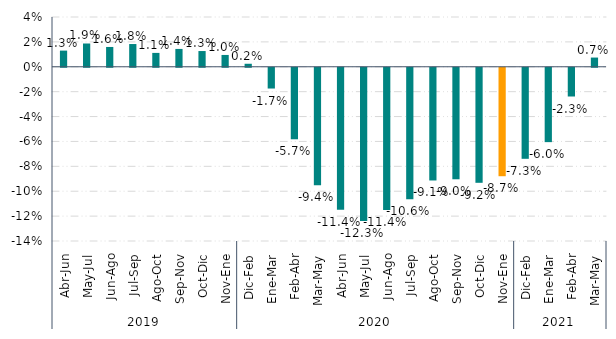
| Category | Total País |
|---|---|
| 0 | 0.013 |
| 1 | 0.019 |
| 2 | 0.016 |
| 3 | 0.018 |
| 4 | 0.011 |
| 5 | 0.014 |
| 6 | 0.013 |
| 7 | 0.01 |
| 8 | 0.002 |
| 9 | -0.017 |
| 10 | -0.057 |
| 11 | -0.094 |
| 12 | -0.114 |
| 13 | -0.123 |
| 14 | -0.114 |
| 15 | -0.106 |
| 16 | -0.091 |
| 17 | -0.09 |
| 18 | -0.092 |
| 19 | -0.087 |
| 20 | -0.073 |
| 21 | -0.06 |
| 22 | -0.023 |
| 23 | 0.007 |